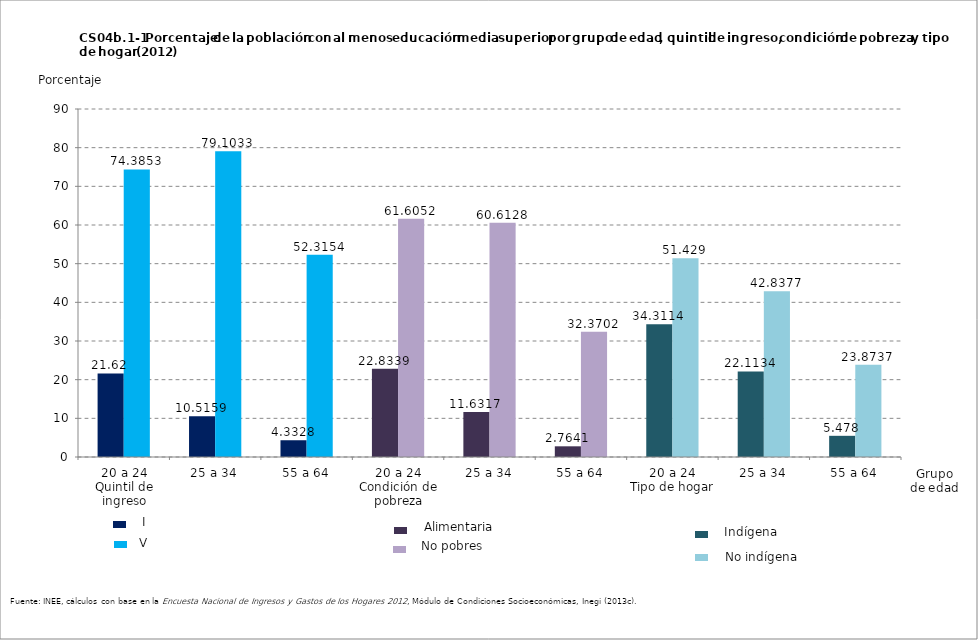
| Category | Series 0 | Series 1 |
|---|---|---|
| 0 | 21.62 | 74.385 |
| 1 | 10.516 | 79.103 |
| 2 | 4.333 | 52.315 |
| 3 | 22.834 | 61.605 |
| 4 | 11.632 | 60.613 |
| 5 | 2.764 | 32.37 |
| 6 | 34.311 | 51.429 |
| 7 | 22.113 | 42.838 |
| 8 | 5.478 | 23.874 |